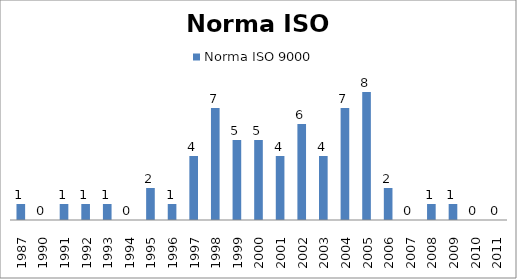
| Category | Norma ISO 9000  |
|---|---|
| 1987.0 | 1 |
| 1990.0 | 0 |
| 1991.0 | 1 |
| 1992.0 | 1 |
| 1993.0 | 1 |
| 1994.0 | 0 |
| 1995.0 | 2 |
| 1996.0 | 1 |
| 1997.0 | 4 |
| 1998.0 | 7 |
| 1999.0 | 5 |
| 2000.0 | 5 |
| 2001.0 | 4 |
| 2002.0 | 6 |
| 2003.0 | 4 |
| 2004.0 | 7 |
| 2005.0 | 8 |
| 2006.0 | 2 |
| 2007.0 | 0 |
| 2008.0 | 1 |
| 2009.0 | 1 |
| 2010.0 | 0 |
| 2011.0 | 0 |